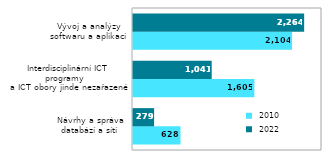
| Category |  2010 |  2022 |
|---|---|---|
| Návrhy a správa
databází a sítí | 628 | 279 |
|   Interdisciplinární ICT programy
  a ICT obory jinde nezařazené | 1605 | 1041 |
| Vývoj a analýzy
softwaru a aplikací | 2104 | 2264 |